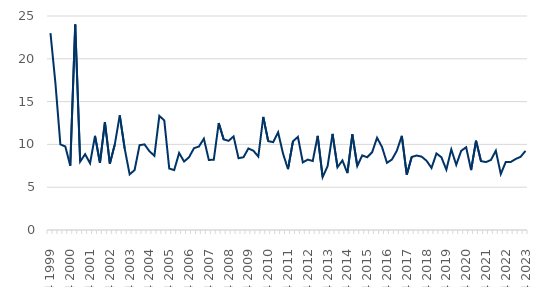
| Category | Series 0 |
|---|---|
| Q4 1999 | 23 |
| Q1 2000 | 17.167 |
| Q2 2000 | 10 |
| Q3 2000 | 9.75 |
| Q4 2000 | 7.5 |
| Q1 2001 | 24 |
| Q2 2001 | 8 |
| Q3 2001 | 8.857 |
| Q4 2001 | 7.8 |
| Q1 2002 | 11 |
| Q2 2002 | 7.833 |
| Q3 2002 | 12.6 |
| Q4 2002 | 7.75 |
| Q1 2003 | 10 |
| Q2 2003 | 13.4 |
| Q3 2003 | 9.5 |
| Q4 2003 | 6.5 |
| Q1 2004 | 7 |
| Q2 2004 | 9.909 |
| Q3 2004 | 10 |
| Q4 2004 | 9.2 |
| Q1 2005 | 8.667 |
| Q2 2005 | 13.333 |
| Q3 2005 | 12.8 |
| Q4 2005 | 7.182 |
| Q1 2006 | 7 |
| Q2 2006 | 9 |
| Q3 2006 | 8 |
| Q4 2006 | 8.5 |
| Q1 2007 | 9.556 |
| Q2 2007 | 9.75 |
| Q3 2007 | 10.667 |
| Q4 2007 | 8.188 |
| Q1 2008 | 8.2 |
| Q2 2008 | 12.5 |
| Q3 2008 | 10.583 |
| Q4 2008 | 10.417 |
| Q1 2009 | 10.933 |
| Q2 2009 | 8.389 |
| Q3 2009 | 8.5 |
| Q4 2009 | 9.526 |
| Q1 2010 | 9.263 |
| Q2 2010 | 8.579 |
| Q3 2010 | 13.211 |
| Q4 2010 | 10.381 |
| Q1 2011 | 10.267 |
| Q2 2011 | 11.417 |
| Q3 2011 | 8.917 |
| Q4 2011 | 7.111 |
| Q1 2012 | 10.353 |
| Q2 2012 | 10.882 |
| Q3 2012 | 7.9 |
| Q4 2012 | 8.222 |
| Q1 2013 | 8.062 |
| Q2 2013 | 11 |
| Q3 2013 | 6.182 |
| Q4 2013 | 7.462 |
| Q1 2014 | 11.222 |
| Q2 2014 | 7.333 |
| Q3 2014 | 8.125 |
| Q4 2014 | 6.65 |
| Q1 2015 | 11.182 |
| Q2 2015 | 7.474 |
| Q3 2015 | 8.714 |
| Q4 2015 | 8.5 |
| Q1 2016 | 9.083 |
| Q2 2016 | 10.778 |
| Q3 2016 | 9.692 |
| Q4 2016 | 7.846 |
| Q1 2017 | 8.231 |
| Q2 2017 | 9.263 |
| Q3 2017 | 11 |
| Q4 2017 | 6.458 |
| Q1 2018 | 8.533 |
| Q2 2018 | 8.7 |
| Q3 2018 | 8.571 |
| Q4 2018 | 8.091 |
| Q1 2019 | 7.25 |
| Q2 2019 | 8.941 |
| Q3 2019 | 8.5 |
| Q4 2019 | 7.045 |
| Q1 2020 | 9.409 |
| Q2 2020 | 7.615 |
| Q3 2020 | 9.25 |
| Q4 2020 | 9.667 |
| Q1 2021 | 7 |
| Q2 2021 | 10.429 |
| Q3 2021 | 8.048 |
| Q4 2021 | 7.938 |
| Q1 2022 | 8.176 |
| Q2 2022 | 9.267 |
| Q3 2022 | 6.538 |
| Q4 2022 | 7.944 |
| Q1 2023 | 7.941 |
| Q2 2023 | 8.294 |
| Q3 2023 | 8.55 |
| Q4 2023 | 9.243 |